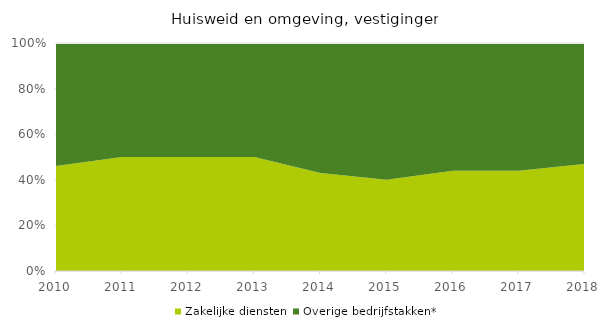
| Category | Zakelijke diensten | Overige bedrijfstakken* |
|---|---|---|
| 2010 | 0.46 | 0.54 |
| 2011 | 0.5 | 0.5 |
| 2012 | 0.5 | 0.5 |
| 2013 | 0.5 | 0.5 |
| 2014 | 0.43 | 0.57 |
| 2015 | 0.4 | 0.6 |
| 2016 | 0.44 | 0.56 |
| 2017 | 0.44 | 0.56 |
| 2018 | 0.47 | 0.53 |